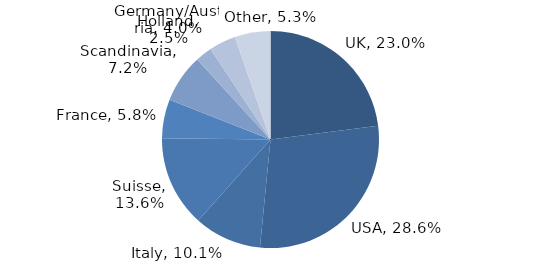
| Category | Investment Style |
|---|---|
| UK | 0.23 |
| USA | 0.286 |
| Italy | 0.101 |
| Suisse | 0.136 |
| France | 0.058 |
| Scandinavia | 0.072 |
| Holland | 0.025 |
| Germany/Austria | 0.04 |
| Other | 0.053 |